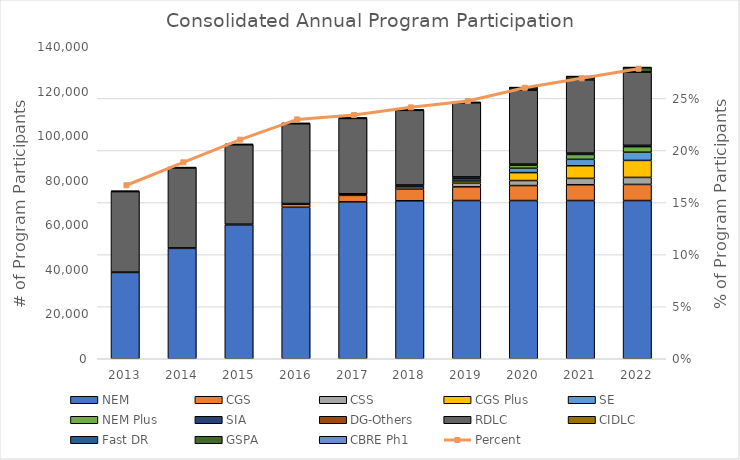
| Category | NEM | CGS | CSS | CGS Plus | SE | NEM Plus | SIA | DG-Others | RDLC | CIDLC | Fast DR | GSPA | CBRE Ph1 |
|---|---|---|---|---|---|---|---|---|---|---|---|---|---|
| 2013.0 | 38724 | 0 | 0 | 0 | 0 | 0 | 132 | 31 | 36100 | 198 | 41 | 0 | 0 |
| 2014.0 | 49536 | 0 | 0 | 0 | 0 | 0 | 180 | 34 | 35850 | 196 | 46 | 0 | 0 |
| 2015.0 | 60107 | 0 | 0 | 0 | 0 | 0 | 248 | 36 | 35629 | 191 | 46 | 0 | 0 |
| 2016.0 | 67957 | 1363 | 7 | 0 | 0 | 0 | 290 | 39 | 35786 | 190 | 46 | 0 | 0 |
| 2017.0 | 70400 | 2923 | 309 | 0 | 0 | 0 | 346 | 40 | 33823 | 192 | 45 | 0 | 0 |
| 2018.0 | 70886 | 5216 | 1088 | 135 | 209 | 0 | 396 | 43 | 33495 | 192 | 43 | 0 | 0 |
| 2019.0 | 71001 | 6128 | 1659 | 970 | 950 | 395 | 453 | 46 | 33260 | 192 | 52 | 0 | 0 |
| 2020.0 | 71000 | 6719 | 2249 | 3543 | 1958 | 1354 | 493 | 47 | 33170 | 206 | 47 | 892 | 1 |
| 2021.0 | 70996 | 7092 | 2855 | 5661 | 2880 | 2183 | 579 | 47 | 32889 | 203 | 46 | 1199 | 1 |
| 2022.0 | 70999 | 7222 | 3151 | 7632 | 3677 | 2483 | 572 | 47 | 32802 | 203 | 43 | 1846 | 1 |